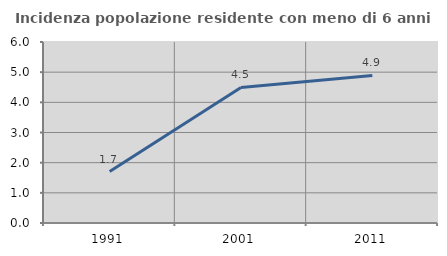
| Category | Incidenza popolazione residente con meno di 6 anni |
|---|---|
| 1991.0 | 1.705 |
| 2001.0 | 4.494 |
| 2011.0 | 4.891 |